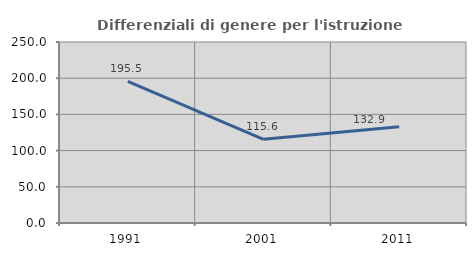
| Category | Differenziali di genere per l'istruzione superiore |
|---|---|
| 1991.0 | 195.473 |
| 2001.0 | 115.584 |
| 2011.0 | 132.928 |